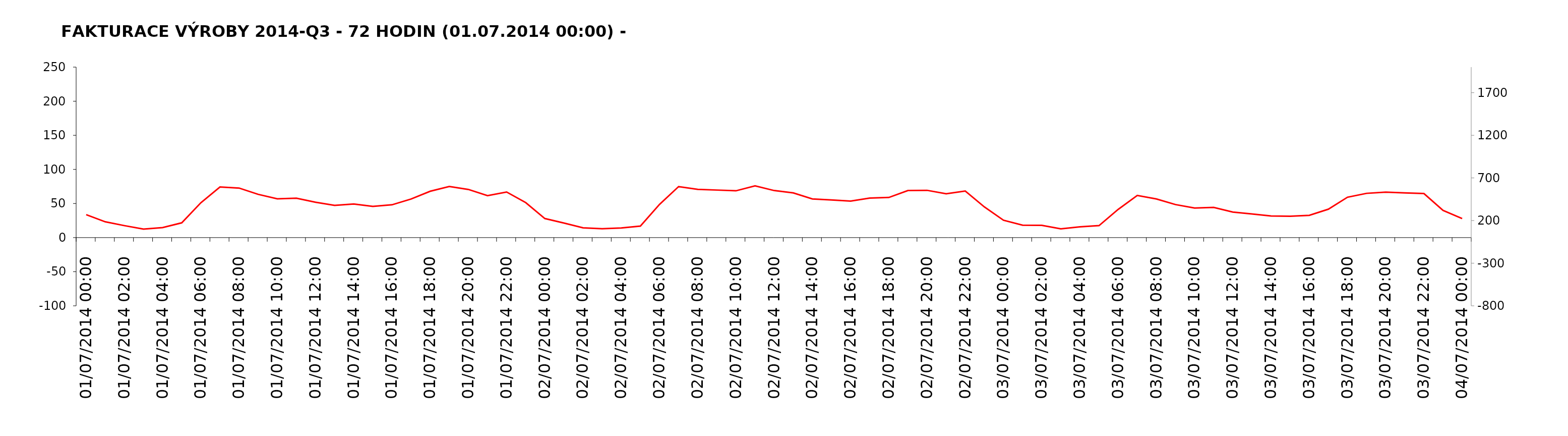
| Category | měření [MWh] |
|---|---|
| 01/07/2014 | 0 |
| 01/07/2014 | 0 |
| 01/07/2014 | 0 |
| 01/07/2014 | 0 |
| 01/07/2014 | 0 |
| 01/07/2014 | 0 |
| 01/07/2014 | 0 |
| 01/07/2014 | 0 |
| 01/07/2014 | 0 |
| 01/07/2014 | 0 |
| 01/07/2014 | 0 |
| 01/07/2014 | 0 |
| 01/07/2014 | 0 |
| 01/07/2014 | 0 |
| 01/07/2014 | 0 |
| 01/07/2014 | 0 |
| 01/07/2014 | 0 |
| 01/07/2014 | 0 |
| 01/07/2014 | 0 |
| 01/07/2014 | 0 |
| 01/07/2014 | 0 |
| 01/07/2014 | 0 |
| 01/07/2014 | 0 |
| 01/07/2014 | 0 |
| 02/07/2014 | 0 |
| 02/07/2014 | 0 |
| 02/07/2014 | 0 |
| 02/07/2014 | 0 |
| 02/07/2014 | 0 |
| 02/07/2014 | 0 |
| 02/07/2014 | 0 |
| 02/07/2014 | 0 |
| 02/07/2014 | 0 |
| 02/07/2014 | 0 |
| 02/07/2014 | 0 |
| 02/07/2014 | 0 |
| 02/07/2014 | 0 |
| 02/07/2014 | 0 |
| 02/07/2014 | 0 |
| 02/07/2014 | 0 |
| 02/07/2014 | 0 |
| 02/07/2014 | 0 |
| 02/07/2014 | 0 |
| 02/07/2014 | 0 |
| 02/07/2014 | 0 |
| 02/07/2014 | 0 |
| 02/07/2014 | 0 |
| 02/07/2014 | 0 |
| 03/07/2014 | 0 |
| 03/07/2014 | 0 |
| 03/07/2014 | 0 |
| 03/07/2014 | 0 |
| 03/07/2014 | 0 |
| 03/07/2014 | 0 |
| 03/07/2014 | 0 |
| 03/07/2014 | 0 |
| 03/07/2014 | 0 |
| 03/07/2014 | 0 |
| 03/07/2014 | 0 |
| 03/07/2014 | 0 |
| 03/07/2014 | 0 |
| 03/07/2014 | 0 |
| 03/07/2014 | 0 |
| 03/07/2014 | 0 |
| 03/07/2014 | 0 |
| 03/07/2014 | 0 |
| 03/07/2014 | 0 |
| 03/07/2014 | 0 |
| 03/07/2014 | 0 |
| 03/07/2014 | 0 |
| 03/07/2014 | 0 |
| 03/07/2014 | 0 |
| 04/07/2014 | 0 |